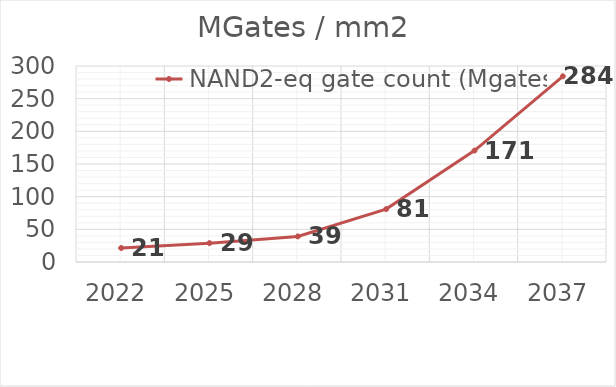
| Category | NAND2-eq gate count (Mgates/mm2) |
|---|---|
| 2022.0 | 21.433 |
| 2025.0 | 28.879 |
| 2028.0 | 39.193 |
| 2031.0 | 81.019 |
| 2034.0 | 170.565 |
| 2037.0 | 284.276 |